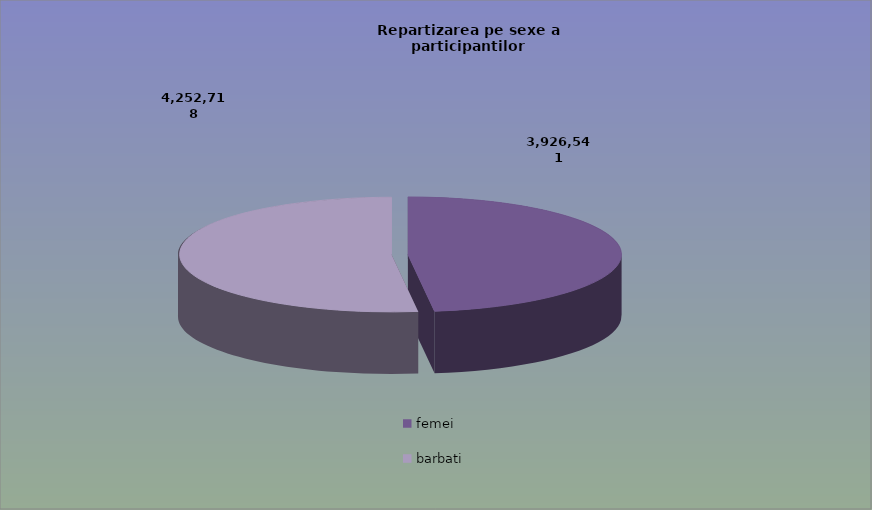
| Category | Series 0 |
|---|---|
| femei | 3926541 |
| barbati | 4252718 |